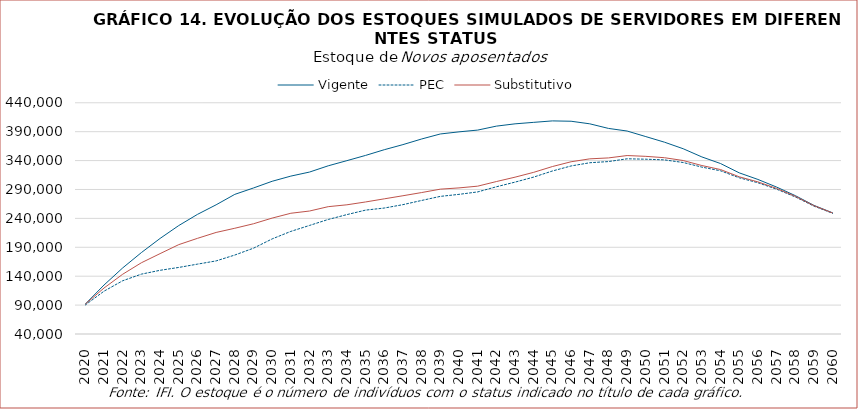
| Category | Vigente | PEC | Substitutivo |
|---|---|---|---|
| 2020.0 | 91858 | 90241 | 91764 |
| 2021.0 | 124716 | 114062 | 119525 |
| 2022.0 | 154364 | 132141 | 143393 |
| 2023.0 | 180837 | 143568 | 163252 |
| 2024.0 | 205319 | 150200 | 179023 |
| 2025.0 | 227617 | 155152 | 194605 |
| 2026.0 | 246919 | 160857 | 205457 |
| 2027.0 | 263490 | 166439 | 215679 |
| 2028.0 | 281572 | 176609 | 222943 |
| 2029.0 | 292601 | 188448 | 230727 |
| 2030.0 | 304203 | 204519 | 240518 |
| 2031.0 | 313156 | 217509 | 248890 |
| 2032.0 | 320149 | 227823 | 252739 |
| 2033.0 | 330974 | 238149 | 260279 |
| 2034.0 | 339878 | 246552 | 263501 |
| 2035.0 | 348947 | 254312 | 268425 |
| 2036.0 | 358818 | 257904 | 273832 |
| 2037.0 | 367611 | 263768 | 279171 |
| 2038.0 | 377364 | 271024 | 284693 |
| 2039.0 | 386043 | 278087 | 290553 |
| 2040.0 | 389703 | 281576 | 292741 |
| 2041.0 | 392754 | 285806 | 295755 |
| 2042.0 | 399592 | 294673 | 303724 |
| 2043.0 | 403571 | 302747 | 311308 |
| 2044.0 | 406133 | 311490 | 319712 |
| 2045.0 | 408665 | 321991 | 329698 |
| 2046.0 | 408075 | 330708 | 337975 |
| 2047.0 | 403604 | 336267 | 343011 |
| 2048.0 | 395657 | 338301 | 344613 |
| 2049.0 | 391103 | 343082 | 348736 |
| 2050.0 | 381501 | 342393 | 347324 |
| 2051.0 | 371811 | 341205 | 344980 |
| 2052.0 | 360491 | 336688 | 340115 |
| 2053.0 | 346325 | 328711 | 331424 |
| 2054.0 | 334899 | 322337 | 324477 |
| 2055.0 | 318776 | 310223 | 311953 |
| 2056.0 | 307380 | 301660 | 303159 |
| 2057.0 | 294184 | 290525 | 291808 |
| 2058.0 | 279409 | 277126 | 278212 |
| 2059.0 | 262492 | 261166 | 261960 |
| 2060.0 | 249563 | 248811 | 249340 |